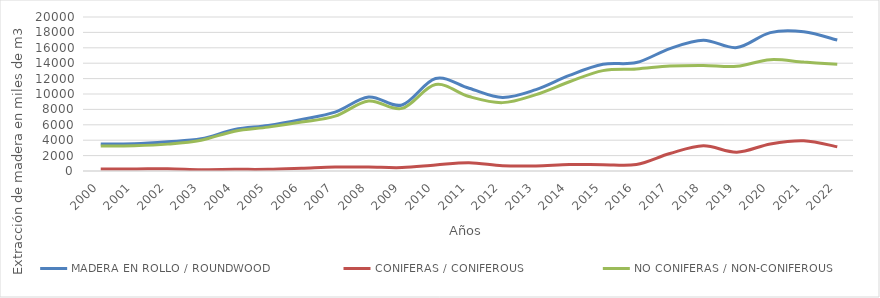
| Category | MADERA EN ROLLO / ROUNDWOOD | CONIFERAS / CONIFEROUS  | NO CONIFERAS / NON-CONIFEROUS  |
|---|---|---|---|
| 2000.0 | 3498.824 | 263 | 3235.824 |
| 2001.0 | 3536.052 | 263 | 3273.052 |
| 2002.0 | 3794.206 | 304 | 3490.206 |
| 2003.0 | 4175.492 | 177 | 3998.492 |
| 2004.0 | 5387.691 | 213 | 5174.691 |
| 2005.0 | 5919.793 | 221 | 5698.793 |
| 2006.0 | 6706.388 | 354 | 6352.388 |
| 2007.0 | 7645.66 | 519 | 7126.66 |
| 2008.0 | 9598.638 | 507 | 9091.638 |
| 2009.0 | 8576.616 | 448 | 8128.616 |
| 2010.0 | 12005.424 | 783 | 11222.424 |
| 2011.0 | 10745.306 | 1079 | 9666.306 |
| 2012.0 | 9559.888 | 679.984 | 8879.904 |
| 2013.0 | 10576.55 | 652.307 | 9924.243 |
| 2014.0 | 12418.458 | 832.225 | 11586.232 |
| 2015.0 | 13851.679 | 815.869 | 13035.809 |
| 2016.0 | 14082.691 | 835.41 | 13247.281 |
| 2017.0 | 15895.768 | 2265.783 | 13629.985 |
| 2018.0 | 16987.261 | 3278.311 | 13709.83 |
| 2019.0 | 16034 | 2444 | 13590 |
| 2020.0 | 17975.031 | 3511.204 | 14463.827 |
| 2021.0 | 18079.178 | 3930.862 | 14148.316 |
| 2022.0 | 17006.01 | 3141.314 | 13864.697 |